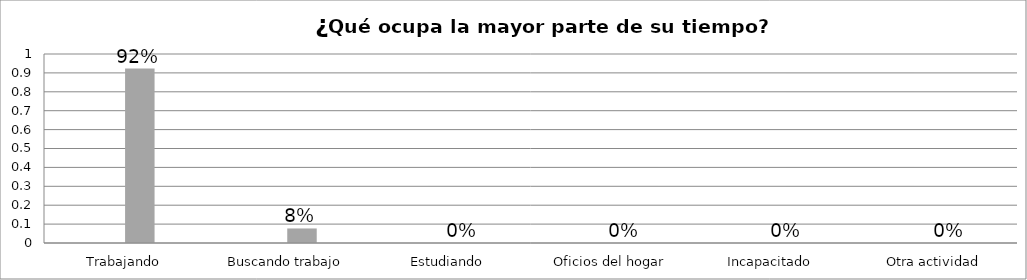
| Category | Series 0 | Series 1 | Series 2 | Series 3 |
|---|---|---|---|---|
| Trabajando |  |  | 0.923 |  |
| Buscando trabajo |  |  | 0.077 |  |
| Estudiando |  |  | 0 |  |
| Oficios del hogar |  |  | 0 |  |
| Incapacitado  |  |  | 0 |  |
| Otra actividad |  |  | 0 |  |